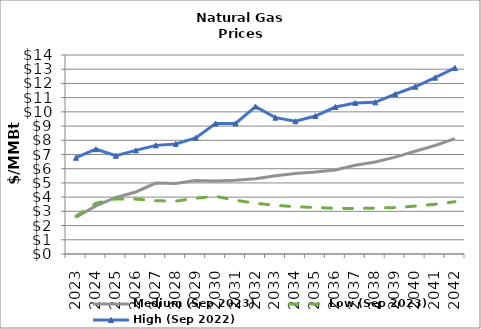
| Category | Medium (Sep 2023) | Low (Sep 2023) | High (Sep 2022) |
|---|---|---|---|
| 2023.0 | 2.594 | 2.656 | 6.774 |
| 2024.0 | 3.385 | 3.566 | 7.371 |
| 2025.0 | 3.976 | 3.878 | 6.909 |
| 2026.0 | 4.364 | 3.861 | 7.29 |
| 2027.0 | 4.988 | 3.751 | 7.643 |
| 2028.0 | 4.953 | 3.718 | 7.741 |
| 2029.0 | 5.165 | 3.927 | 8.164 |
| 2030.0 | 5.141 | 4.056 | 9.173 |
| 2031.0 | 5.192 | 3.784 | 9.187 |
| 2032.0 | 5.297 | 3.569 | 10.372 |
| 2033.0 | 5.502 | 3.427 | 9.593 |
| 2034.0 | 5.657 | 3.323 | 9.336 |
| 2035.0 | 5.762 | 3.274 | 9.704 |
| 2036.0 | 5.91 | 3.212 | 10.34 |
| 2037.0 | 6.239 | 3.203 | 10.627 |
| 2038.0 | 6.473 | 3.227 | 10.67 |
| 2039.0 | 6.816 | 3.266 | 11.242 |
| 2040.0 | 7.23 | 3.37 | 11.765 |
| 2041.0 | 7.63 | 3.502 | 12.404 |
| 2042.0 | 8.119 | 3.677 | 13.089 |